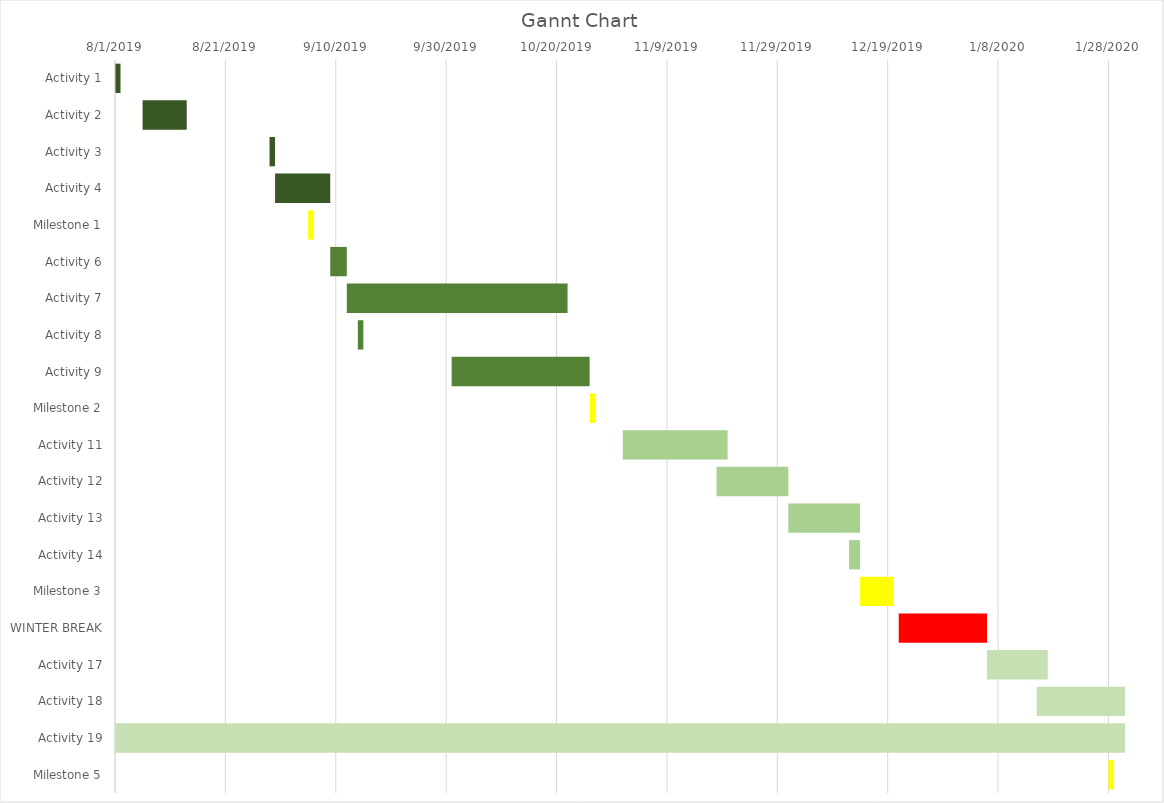
| Category | Start Dates | Duration |
|---|---|---|
| Activity 1 | 8/1/19 | 1 |
| Activity 2 | 8/6/19 | 8 |
| Activity 3 | 8/29/19 | 1 |
| Activity 4 | 8/30/19 | 10 |
| Milestone 1 | 9/5/19 | 1 |
| Activity 6 | 9/9/19 | 3 |
| Activity 7 | 9/12/19 | 40 |
| Activity 8 | 9/14/19 | 1 |
| Activity 9 | 10/1/19 | 25 |
| Milestone 2 | 10/26/19 | 1 |
| Activity 11 | 11/1/19 | 19 |
| Activity 12 | 11/18/19 | 13 |
| Activity 13 | 12/1/19 | 13 |
| Activity 14 | 12/12/19 | 2 |
| Milestone 3 | 12/14/19 | 6 |
| WINTER BREAK | 12/21/19 | 16 |
| Activity 17 | 1/6/20 | 11 |
| Activity 18 | 1/15/20 | 16 |
| Activity 19 | 8/1/19 | 183 |
| Milestone 5 | 1/28/20 | 1 |